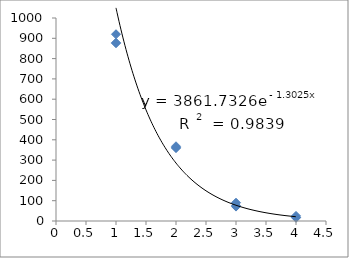
| Category | Series 0 |
|---|---|
| 1.0 | 920 |
| 1.0 | 876 |
| 1.0 | 878 |
| 2.0 | 360 |
| 2.0 | 368 |
| 2.0 | 360 |
| 3.0 | 76 |
| 3.0 | 90 |
| 3.0 | 71 |
| 4.0 | 16 |
| 4.0 | 18 |
| 4.0 | 25 |